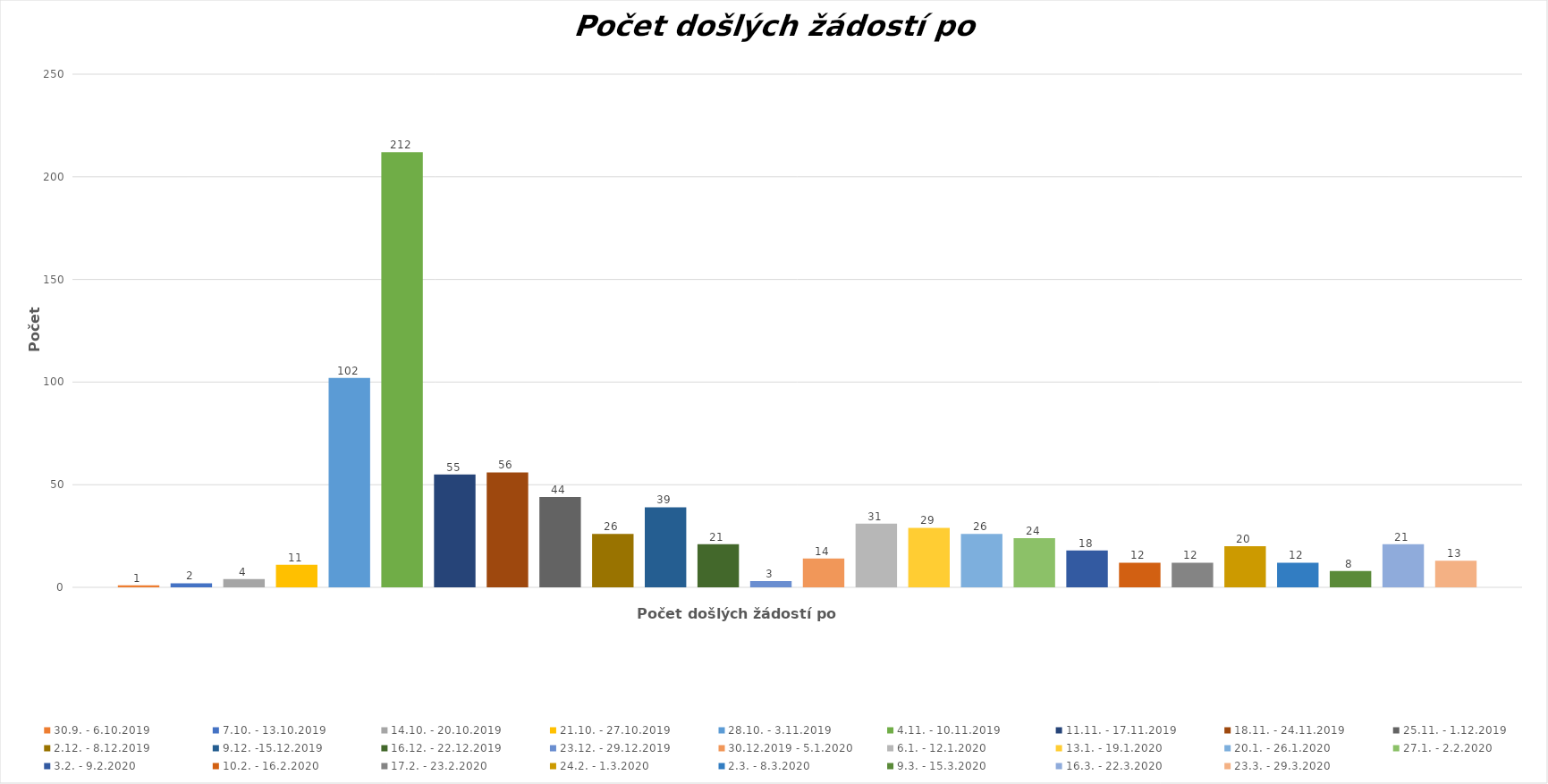
| Category | 30.9. - 6.10.2019 | 7.10. - 13.10.2019 | 14.10. - 20.10.2019 | 21.10. - 27.10.2019 | 28.10. - 3.11.2019 | 4.11. - 10.11.2019 | 11.11. - 17.11.2019 | 18.11. - 24.11.2019 | 25.11. - 1.12.2019 | 2.12. - 8.12.2019 | 9.12. -15.12.2019 | 16.12. - 22.12.2019 | 23.12. - 29.12.2019 | 30.12.2019 - 5.1.2020 | 6.1. - 12.1.2020 | 13.1. - 19.1.2020 | 20.1. - 26.1.2020 | 27.1. - 2.2.2020 | 3.2. - 9.2.2020 | 10.2. - 16.2.2020 | 17.2. - 23.2.2020 | 24.2. - 1.3.2020 | 2.3. - 8.3.2020 | 9.3. - 15.3.2020 | 16.3. - 22.3.2020 | 23.3. - 29.3.2020 | 30.3. - 5.4.2020 | 6.4. - 12.4.2020 | 13.4. - 19.4.2020 | 20.4. - 26.4.2020 | 27.4. - 3.5.2020 | 4.5. - 10.5.2020 |
|---|---|---|---|---|---|---|---|---|---|---|---|---|---|---|---|---|---|---|---|---|---|---|---|---|---|---|---|---|---|---|---|---|
| Počet došlých žádostí | 1 | 2 | 4 | 11 | 102 | 212 | 55 | 56 | 44 | 26 | 39 | 21 | 3 | 14 | 31 | 29 | 26 | 24 | 18 | 12 | 12 | 20 | 12 | 8 | 21 | 13 |  |  |  |  |  |  |